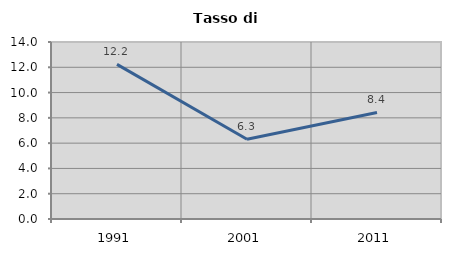
| Category | Tasso di disoccupazione   |
|---|---|
| 1991.0 | 12.232 |
| 2001.0 | 6.304 |
| 2011.0 | 8.427 |